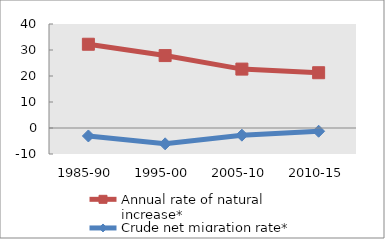
| Category | Annual rate of natural increase* | Crude net migration rate* |
|---|---|---|
| 1985-90 | 32.213 | -3.063 |
| 1995-00 | 27.854 | -6.088 |
| 2005-10 | 22.655 | -2.755 |
| 2010-15 | 21.258 | -1.246 |